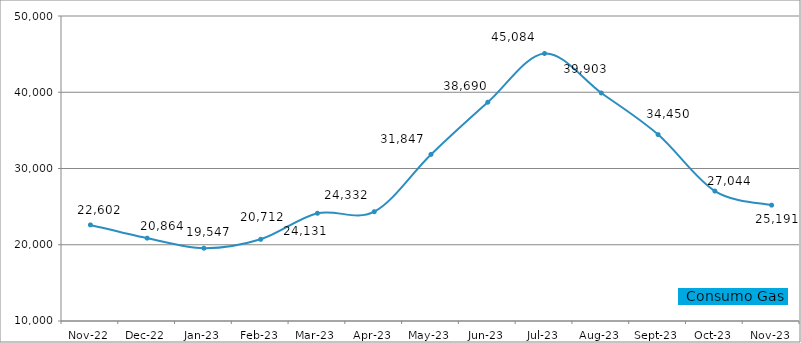
| Category | Gas |
|---|---|
| 2022-11-01 | 22602 |
| 2022-12-01 | 20864 |
| 2023-01-01 | 19547 |
| 2023-02-01 | 20712 |
| 2023-03-01 | 24131 |
| 2023-04-01 | 24332 |
| 2023-05-01 | 31847 |
| 2023-06-01 | 38690 |
| 2023-07-01 | 45084 |
| 2023-08-01 | 39903 |
| 2023-09-01 | 34450 |
| 2023-10-01 | 27044 |
| 2023-11-01 | 25191 |